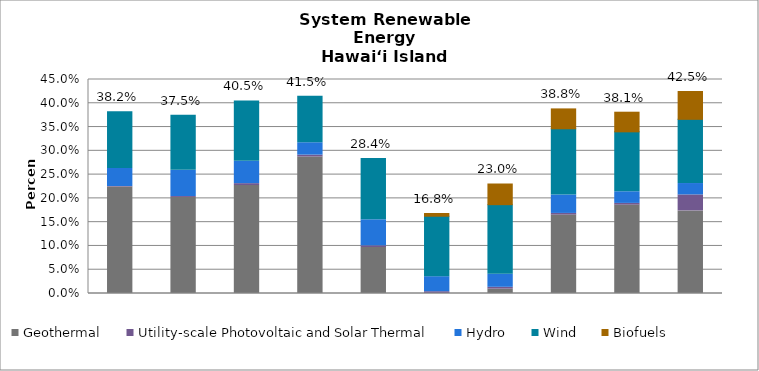
| Category | Geothermal | Utility-scale Photovoltaic and Solar Thermal | Hydro | Wind | Biofuels |
|---|---|---|---|---|---|
| 2014.0 | 0.224 | 0.001 | 0.038 | 0.119 | 0 |
| 2015.0 | 0.202 | 0.002 | 0.055 | 0.116 | 0 |
| 2016.0 | 0.227 | 0.004 | 0.047 | 0.127 | 0 |
| 2017.0 | 0.287 | 0.004 | 0.026 | 0.098 | 0 |
| 2018.0 | 0.097 | 0.003 | 0.055 | 0.129 | 0 |
| 2019.0 | 0 | 0.004 | 0.032 | 0.127 | 0.006 |
| 2020.0 | 0.009 | 0.004 | 0.027 | 0.146 | 0.043 |
| 2021.0 | 0.165 | 0.003 | 0.039 | 0.139 | 0.042 |
| 2022.0 | 0.186 | 0.004 | 0.024 | 0.126 | 0.041 |
| 2023.0 | 0.174 | 0.034 | 0.024 | 0.135 | 0.059 |